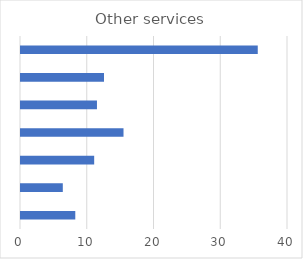
| Category | Other services |
|---|---|
| Chamber of commerce | 8.133 |
| Female group | 6.263 |
| Group similar jobs | 10.963 |
| Industry group | 15.357 |
| Other | 11.379 |
| SME group | 12.435 |
| None | 35.47 |